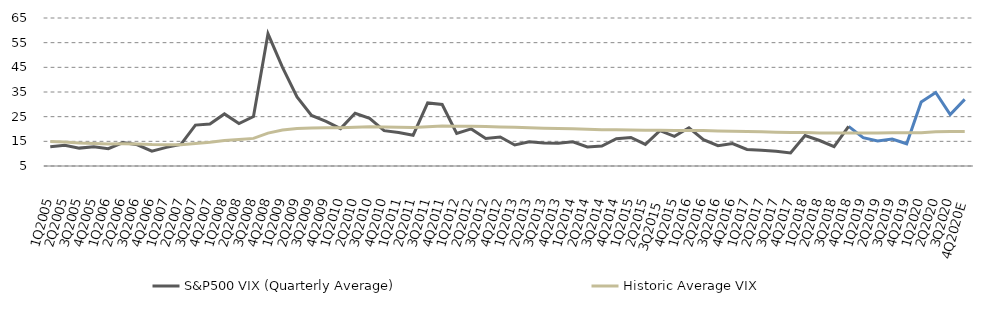
| Category | S&P500 VIX (Quarterly Average) | Historic Average VIX  |
|---|---|---|
| 4Q2020E | 32 | 18.997 |
| 3Q2020 | 25.88 | 18.997 |
| 2Q2020 | 34.791 | 18.886 |
| 1Q2020 | 30.948 | 18.494 |
| 4Q2019 | 14.02 | 18.494 |
| 3Q2019 | 15.947 | 18.494 |
| 2Q2019 | 15.16 | 18.405 |
| 1Q2019 | 16.47 | 18.423 |
| 4Q2018 | 21.054 | 18.423 |
| 3Q2018 | 12.857 | 18.423 |
| 2Q2018 | 15.338 | 18.423 |
| 1Q2018 | 17.355 | 18.532 |
| 4Q2017 | 10.308 | 18.553 |
| 3Q2017 | 10.944 | 18.703 |
| 2Q2017 | 11.426 | 18.847 |
| 1Q2017 | 11.692 | 18.987 |
| 4Q2016 | 14.098 | 19.127 |
| 3Q2016 | 13.234 | 19.226 |
| 2Q2016 | 15.676 | 19.345 |
| 1Q2016 | 20.486 | 19.42 |
| 4Q2015 | 17.033 | 19.398 |
| 3Q2015  | 19.307 | 19.448 |
| 2Q2015 | 13.74 | 19.451 |
| 1Q2015 | 16.565 | 19.578 |
| 4Q2014 | 16.072 | 19.647 |
| 3Q2014 | 13.073 | 19.73 |
| 2Q2014 | 12.738 | 19.888 |
| 1Q2014 | 14.829 | 20.063 |
| 4Q2013 | 14.233 | 20.194 |
| 3Q2013 | 14.28 | 20.347 |
| 2Q2013 | 14.837 | 20.506 |
| 1Q2013 | 13.527 | 20.659 |
| 4Q2012 | 16.753 | 20.858 |
| 3Q2012 | 16.193 | 20.975 |
| 2Q2012 | 20.036 | 21.115 |
| 1Q2012 | 18.204 | 21.148 |
| 4Q2011 | 29.94 | 21.24 |
| 3Q2011 | 30.584 | 20.96 |
| 2Q2011 | 17.482 | 20.639 |
| 1Q2011 | 18.615 | 20.748 |
| 4Q2010 | 19.318 | 20.824 |
| 3Q2010 | 24.284 | 20.879 |
| 2Q2010 | 26.391 | 20.749 |
| 1Q2010 | 20.15 | 20.523 |
| 4Q2009 | 23.07 | 20.538 |
| 3Q2009 | 25.486 | 20.428 |
| 2Q2009 | 33.016 | 20.198 |
| 1Q2009 | 45 | 19.588 |
| 4Q2008 | 58.596 | 18.317 |
| 3Q2008 | 25.073 | 16.198 |
| 2Q2008 | 22.224 | 15.704 |
| 1Q2008 | 26.12 | 15.321 |
| 4Q2007 | 22.03 | 14.646 |
| 3Q2007 | 21.589 | 14.154 |
| 2Q2007 | 13.732 | 13.623 |
| 1Q2007 | 12.564 | 13.614 |
| 4Q2006 | 11.035 | 13.702 |
| 3Q2006 | 13.608 | 13.944 |
| 2Q2006 | 14.529 | 13.978 |
| 1Q2006 | 12.042 | 13.917 |
| 4Q2005 | 12.782 | 14.151 |
| 3Q2005 | 12.251 | 14.346 |
| 2Q2005 | 13.407 | 14.696 |
| 1Q2005 | 12.787 | 14.953 |